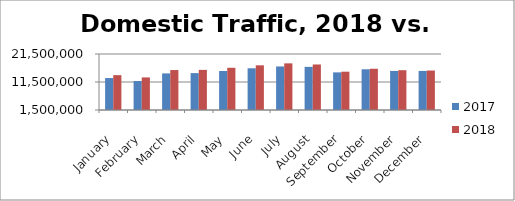
| Category | 2017 | 2018 |
|---|---|---|
| January | 12913679 | 13940710 |
| February | 11845323 | 13134610 |
| March | 14571118 | 15769185 |
| April | 14671782 | 15828353 |
| May | 15430236 | 16574481 |
| June | 16398879 | 17457154 |
| July | 17046512 | 18158916 |
| August | 16910392 | 17755852 |
| September | 14936483 | 15184737 |
| October | 16041566 | 16229561 |
| November | 15452865 | 15712684 |
| December | 15451522 | 15600539 |